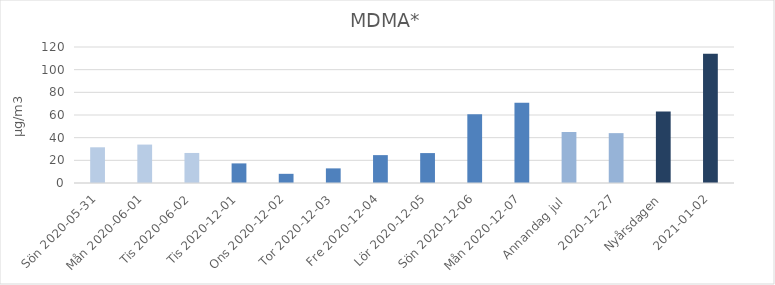
| Category | MDMA* |
|---|---|
| Sön 2020-05-31 | 31.5 |
| Mån 2020-06-01 | 33.9 |
|  Tis 2020-06-02 | 26.5 |
| Tis 2020-12-01 | 17.3 |
| Ons 2020-12-02 | 8.1 |
| Tor 2020-12-03 | 12.9 |
| Fre 2020-12-04 | 24.6 |
| Lör 2020-12-05 | 26.4 |
| Sön 2020-12-06 | 60.7 |
| Mån 2020-12-07 | 70.9 |
| Annandag jul  | 45 |
| 2020-12-27 | 44 |
| Nyårsdagen | 63 |
| 2021-01-02 | 114 |